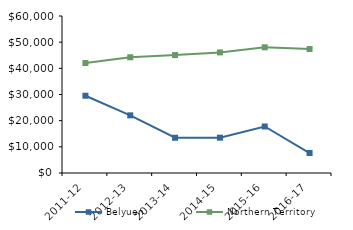
| Category | Belyuen | Northern Territory |
|---|---|---|
| 2011-12 | 29520.95 | 42021 |
| 2012-13 | 22033 | 44232.02 |
| 2013-14 | 13464.92 | 45075.51 |
| 2014-15 | 13500 | 46083.65 |
| 2015-16 | 17774.49 | 48046.27 |
| 2016-17 | 7635.97 | 47367.05 |